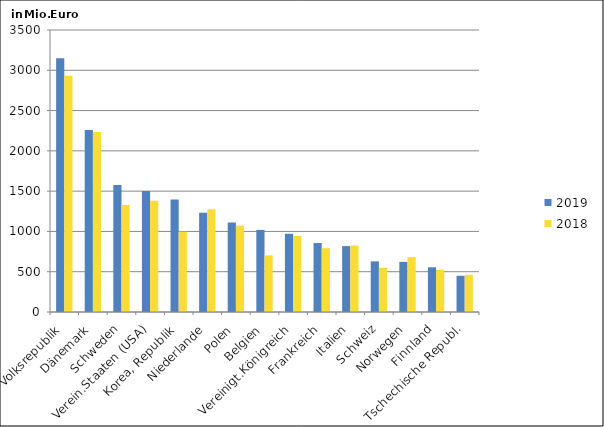
| Category | 2019 | 2018 |
|---|---|---|
| China, Volksrepublik | 3150.347 | 2933.376 |
| Dänemark | 2259.923 | 2234.554 |
| Schweden | 1576.155 | 1328.919 |
| Verein.Staaten (USA) | 1500.786 | 1379.591 |
| Korea, Republik | 1395.29 | 996.479 |
| Niederlande | 1233.15 | 1274.347 |
| Polen | 1109.371 | 1069.703 |
| Belgien | 1019.23 | 702.776 |
| Vereinigt.Königreich | 970.867 | 943.057 |
| Frankreich | 855.825 | 791.816 |
| Italien | 818.04 | 825.278 |
| Schweiz | 628.663 | 547.946 |
| Norwegen | 622.134 | 682.059 |
| Finnland | 554.749 | 523.594 |
| Tschechische Republ. | 449.705 | 462.298 |